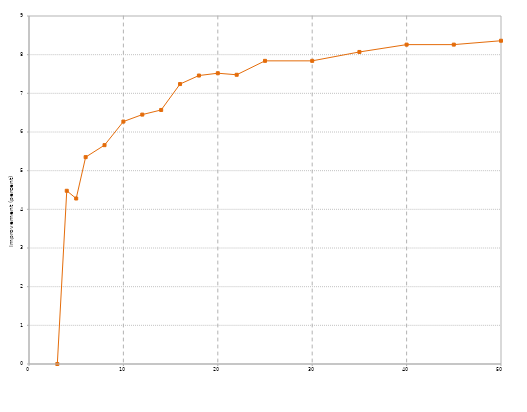
| Category | průměrné zlepšení |
|---|---|
| 3.0 | 0 |
| 4.0 | 4.48 |
| 5.0 | 4.28 |
| 6.0 | 5.35 |
| 8.0 | 5.66 |
| 10.0 | 6.27 |
| 12.0 | 6.45 |
| 14.0 | 6.57 |
| 16.0 | 7.24 |
| 18.0 | 7.46 |
| 20.0 | 7.52 |
| 22.0 | 7.48 |
| 25.0 | 7.84 |
| 30.0 | 7.84 |
| 35.0 | 8.07 |
| 40.0 | 8.26 |
| 45.0 | 8.26 |
| 50.0 | 8.36 |